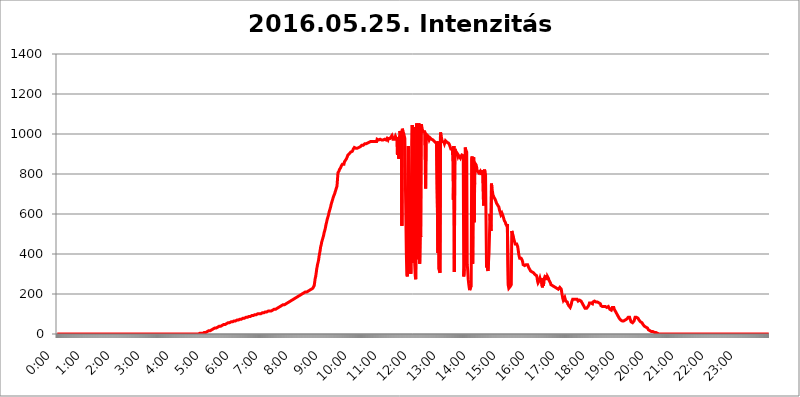
| Category | 2016.05.25. Intenzitás [W/m^2] |
|---|---|
| 0.0 | 0 |
| 0.0006944444444444445 | 0 |
| 0.001388888888888889 | 0 |
| 0.0020833333333333333 | 0 |
| 0.002777777777777778 | 0 |
| 0.003472222222222222 | 0 |
| 0.004166666666666667 | 0 |
| 0.004861111111111111 | 0 |
| 0.005555555555555556 | 0 |
| 0.0062499999999999995 | 0 |
| 0.006944444444444444 | 0 |
| 0.007638888888888889 | 0 |
| 0.008333333333333333 | 0 |
| 0.009027777777777779 | 0 |
| 0.009722222222222222 | 0 |
| 0.010416666666666666 | 0 |
| 0.011111111111111112 | 0 |
| 0.011805555555555555 | 0 |
| 0.012499999999999999 | 0 |
| 0.013194444444444444 | 0 |
| 0.013888888888888888 | 0 |
| 0.014583333333333332 | 0 |
| 0.015277777777777777 | 0 |
| 0.015972222222222224 | 0 |
| 0.016666666666666666 | 0 |
| 0.017361111111111112 | 0 |
| 0.018055555555555557 | 0 |
| 0.01875 | 0 |
| 0.019444444444444445 | 0 |
| 0.02013888888888889 | 0 |
| 0.020833333333333332 | 0 |
| 0.02152777777777778 | 0 |
| 0.022222222222222223 | 0 |
| 0.02291666666666667 | 0 |
| 0.02361111111111111 | 0 |
| 0.024305555555555556 | 0 |
| 0.024999999999999998 | 0 |
| 0.025694444444444447 | 0 |
| 0.02638888888888889 | 0 |
| 0.027083333333333334 | 0 |
| 0.027777777777777776 | 0 |
| 0.02847222222222222 | 0 |
| 0.029166666666666664 | 0 |
| 0.029861111111111113 | 0 |
| 0.030555555555555555 | 0 |
| 0.03125 | 0 |
| 0.03194444444444445 | 0 |
| 0.03263888888888889 | 0 |
| 0.03333333333333333 | 0 |
| 0.034027777777777775 | 0 |
| 0.034722222222222224 | 0 |
| 0.035416666666666666 | 0 |
| 0.036111111111111115 | 0 |
| 0.03680555555555556 | 0 |
| 0.0375 | 0 |
| 0.03819444444444444 | 0 |
| 0.03888888888888889 | 0 |
| 0.03958333333333333 | 0 |
| 0.04027777777777778 | 0 |
| 0.04097222222222222 | 0 |
| 0.041666666666666664 | 0 |
| 0.042361111111111106 | 0 |
| 0.04305555555555556 | 0 |
| 0.043750000000000004 | 0 |
| 0.044444444444444446 | 0 |
| 0.04513888888888889 | 0 |
| 0.04583333333333334 | 0 |
| 0.04652777777777778 | 0 |
| 0.04722222222222222 | 0 |
| 0.04791666666666666 | 0 |
| 0.04861111111111111 | 0 |
| 0.049305555555555554 | 0 |
| 0.049999999999999996 | 0 |
| 0.05069444444444445 | 0 |
| 0.051388888888888894 | 0 |
| 0.052083333333333336 | 0 |
| 0.05277777777777778 | 0 |
| 0.05347222222222222 | 0 |
| 0.05416666666666667 | 0 |
| 0.05486111111111111 | 0 |
| 0.05555555555555555 | 0 |
| 0.05625 | 0 |
| 0.05694444444444444 | 0 |
| 0.057638888888888885 | 0 |
| 0.05833333333333333 | 0 |
| 0.05902777777777778 | 0 |
| 0.059722222222222225 | 0 |
| 0.06041666666666667 | 0 |
| 0.061111111111111116 | 0 |
| 0.06180555555555556 | 0 |
| 0.0625 | 0 |
| 0.06319444444444444 | 0 |
| 0.06388888888888888 | 0 |
| 0.06458333333333334 | 0 |
| 0.06527777777777778 | 0 |
| 0.06597222222222222 | 0 |
| 0.06666666666666667 | 0 |
| 0.06736111111111111 | 0 |
| 0.06805555555555555 | 0 |
| 0.06874999999999999 | 0 |
| 0.06944444444444443 | 0 |
| 0.07013888888888889 | 0 |
| 0.07083333333333333 | 0 |
| 0.07152777777777779 | 0 |
| 0.07222222222222223 | 0 |
| 0.07291666666666667 | 0 |
| 0.07361111111111111 | 0 |
| 0.07430555555555556 | 0 |
| 0.075 | 0 |
| 0.07569444444444444 | 0 |
| 0.0763888888888889 | 0 |
| 0.07708333333333334 | 0 |
| 0.07777777777777778 | 0 |
| 0.07847222222222222 | 0 |
| 0.07916666666666666 | 0 |
| 0.0798611111111111 | 0 |
| 0.08055555555555556 | 0 |
| 0.08125 | 0 |
| 0.08194444444444444 | 0 |
| 0.08263888888888889 | 0 |
| 0.08333333333333333 | 0 |
| 0.08402777777777777 | 0 |
| 0.08472222222222221 | 0 |
| 0.08541666666666665 | 0 |
| 0.08611111111111112 | 0 |
| 0.08680555555555557 | 0 |
| 0.08750000000000001 | 0 |
| 0.08819444444444445 | 0 |
| 0.08888888888888889 | 0 |
| 0.08958333333333333 | 0 |
| 0.09027777777777778 | 0 |
| 0.09097222222222222 | 0 |
| 0.09166666666666667 | 0 |
| 0.09236111111111112 | 0 |
| 0.09305555555555556 | 0 |
| 0.09375 | 0 |
| 0.09444444444444444 | 0 |
| 0.09513888888888888 | 0 |
| 0.09583333333333333 | 0 |
| 0.09652777777777777 | 0 |
| 0.09722222222222222 | 0 |
| 0.09791666666666667 | 0 |
| 0.09861111111111111 | 0 |
| 0.09930555555555555 | 0 |
| 0.09999999999999999 | 0 |
| 0.10069444444444443 | 0 |
| 0.1013888888888889 | 0 |
| 0.10208333333333335 | 0 |
| 0.10277777777777779 | 0 |
| 0.10347222222222223 | 0 |
| 0.10416666666666667 | 0 |
| 0.10486111111111111 | 0 |
| 0.10555555555555556 | 0 |
| 0.10625 | 0 |
| 0.10694444444444444 | 0 |
| 0.1076388888888889 | 0 |
| 0.10833333333333334 | 0 |
| 0.10902777777777778 | 0 |
| 0.10972222222222222 | 0 |
| 0.1111111111111111 | 0 |
| 0.11180555555555556 | 0 |
| 0.11180555555555556 | 0 |
| 0.1125 | 0 |
| 0.11319444444444444 | 0 |
| 0.11388888888888889 | 0 |
| 0.11458333333333333 | 0 |
| 0.11527777777777777 | 0 |
| 0.11597222222222221 | 0 |
| 0.11666666666666665 | 0 |
| 0.1173611111111111 | 0 |
| 0.11805555555555557 | 0 |
| 0.11944444444444445 | 0 |
| 0.12013888888888889 | 0 |
| 0.12083333333333333 | 0 |
| 0.12152777777777778 | 0 |
| 0.12222222222222223 | 0 |
| 0.12291666666666667 | 0 |
| 0.12291666666666667 | 0 |
| 0.12361111111111112 | 0 |
| 0.12430555555555556 | 0 |
| 0.125 | 0 |
| 0.12569444444444444 | 0 |
| 0.12638888888888888 | 0 |
| 0.12708333333333333 | 0 |
| 0.16875 | 0 |
| 0.12847222222222224 | 0 |
| 0.12916666666666668 | 0 |
| 0.12986111111111112 | 0 |
| 0.13055555555555556 | 0 |
| 0.13125 | 0 |
| 0.13194444444444445 | 0 |
| 0.1326388888888889 | 0 |
| 0.13333333333333333 | 0 |
| 0.13402777777777777 | 0 |
| 0.13402777777777777 | 0 |
| 0.13472222222222222 | 0 |
| 0.13541666666666666 | 0 |
| 0.1361111111111111 | 0 |
| 0.13749999999999998 | 0 |
| 0.13819444444444443 | 0 |
| 0.1388888888888889 | 0 |
| 0.13958333333333334 | 0 |
| 0.14027777777777778 | 0 |
| 0.14097222222222222 | 0 |
| 0.14166666666666666 | 0 |
| 0.1423611111111111 | 0 |
| 0.14305555555555557 | 0 |
| 0.14375000000000002 | 0 |
| 0.14444444444444446 | 0 |
| 0.1451388888888889 | 0 |
| 0.1451388888888889 | 0 |
| 0.14652777777777778 | 0 |
| 0.14722222222222223 | 0 |
| 0.14791666666666667 | 0 |
| 0.1486111111111111 | 0 |
| 0.14930555555555555 | 0 |
| 0.15 | 0 |
| 0.15069444444444444 | 0 |
| 0.15138888888888888 | 0 |
| 0.15208333333333332 | 0 |
| 0.15277777777777776 | 0 |
| 0.15347222222222223 | 0 |
| 0.15416666666666667 | 0 |
| 0.15486111111111112 | 0 |
| 0.15555555555555556 | 0 |
| 0.15625 | 0 |
| 0.15694444444444444 | 0 |
| 0.15763888888888888 | 0 |
| 0.15833333333333333 | 0 |
| 0.15902777777777777 | 0 |
| 0.15972222222222224 | 0 |
| 0.16041666666666668 | 0 |
| 0.16111111111111112 | 0 |
| 0.16180555555555556 | 0 |
| 0.1625 | 0 |
| 0.16319444444444445 | 0 |
| 0.1638888888888889 | 0 |
| 0.16458333333333333 | 0 |
| 0.16527777777777777 | 0 |
| 0.16597222222222222 | 0 |
| 0.16666666666666666 | 0 |
| 0.1673611111111111 | 0 |
| 0.16805555555555554 | 0 |
| 0.16874999999999998 | 0 |
| 0.16944444444444443 | 0 |
| 0.17013888888888887 | 0 |
| 0.1708333333333333 | 0 |
| 0.17152777777777775 | 0 |
| 0.17222222222222225 | 0 |
| 0.1729166666666667 | 0 |
| 0.17361111111111113 | 0 |
| 0.17430555555555557 | 0 |
| 0.17500000000000002 | 0 |
| 0.17569444444444446 | 0 |
| 0.1763888888888889 | 0 |
| 0.17708333333333334 | 0 |
| 0.17777777777777778 | 0 |
| 0.17847222222222223 | 0 |
| 0.17916666666666667 | 0 |
| 0.1798611111111111 | 0 |
| 0.18055555555555555 | 0 |
| 0.18125 | 0 |
| 0.18194444444444444 | 0 |
| 0.1826388888888889 | 0 |
| 0.18333333333333335 | 0 |
| 0.1840277777777778 | 0 |
| 0.18472222222222223 | 0 |
| 0.18541666666666667 | 0 |
| 0.18611111111111112 | 0 |
| 0.18680555555555556 | 0 |
| 0.1875 | 0 |
| 0.18819444444444444 | 0 |
| 0.18888888888888888 | 0 |
| 0.18958333333333333 | 0 |
| 0.19027777777777777 | 0 |
| 0.1909722222222222 | 0 |
| 0.19166666666666665 | 0 |
| 0.19236111111111112 | 0 |
| 0.19305555555555554 | 0 |
| 0.19375 | 0 |
| 0.19444444444444445 | 0 |
| 0.1951388888888889 | 0 |
| 0.19583333333333333 | 0 |
| 0.19652777777777777 | 0 |
| 0.19722222222222222 | 0 |
| 0.19791666666666666 | 0 |
| 0.1986111111111111 | 0 |
| 0.19930555555555554 | 3.525 |
| 0.19999999999999998 | 3.525 |
| 0.20069444444444443 | 3.525 |
| 0.20138888888888887 | 3.525 |
| 0.2020833333333333 | 3.525 |
| 0.2027777777777778 | 3.525 |
| 0.2034722222222222 | 3.525 |
| 0.2041666666666667 | 3.525 |
| 0.20486111111111113 | 7.887 |
| 0.20555555555555557 | 7.887 |
| 0.20625000000000002 | 7.887 |
| 0.20694444444444446 | 7.887 |
| 0.2076388888888889 | 7.887 |
| 0.20833333333333334 | 7.887 |
| 0.20902777777777778 | 12.257 |
| 0.20972222222222223 | 12.257 |
| 0.21041666666666667 | 12.257 |
| 0.2111111111111111 | 12.257 |
| 0.21180555555555555 | 12.257 |
| 0.2125 | 16.636 |
| 0.21319444444444444 | 16.636 |
| 0.2138888888888889 | 16.636 |
| 0.21458333333333335 | 16.636 |
| 0.2152777777777778 | 21.024 |
| 0.21597222222222223 | 21.024 |
| 0.21666666666666667 | 21.024 |
| 0.21736111111111112 | 21.024 |
| 0.21805555555555556 | 21.024 |
| 0.21875 | 25.419 |
| 0.21944444444444444 | 25.419 |
| 0.22013888888888888 | 25.419 |
| 0.22083333333333333 | 29.823 |
| 0.22152777777777777 | 29.823 |
| 0.2222222222222222 | 29.823 |
| 0.22291666666666665 | 29.823 |
| 0.2236111111111111 | 34.234 |
| 0.22430555555555556 | 34.234 |
| 0.225 | 34.234 |
| 0.22569444444444445 | 34.234 |
| 0.2263888888888889 | 38.653 |
| 0.22708333333333333 | 38.653 |
| 0.22777777777777777 | 38.653 |
| 0.22847222222222222 | 38.653 |
| 0.22916666666666666 | 38.653 |
| 0.2298611111111111 | 38.653 |
| 0.23055555555555554 | 43.079 |
| 0.23124999999999998 | 43.079 |
| 0.23194444444444443 | 43.079 |
| 0.23263888888888887 | 47.511 |
| 0.2333333333333333 | 47.511 |
| 0.2340277777777778 | 47.511 |
| 0.2347222222222222 | 47.511 |
| 0.2354166666666667 | 47.511 |
| 0.23611111111111113 | 51.951 |
| 0.23680555555555557 | 51.951 |
| 0.23750000000000002 | 51.951 |
| 0.23819444444444446 | 51.951 |
| 0.2388888888888889 | 56.398 |
| 0.23958333333333334 | 56.398 |
| 0.24027777777777778 | 56.398 |
| 0.24097222222222223 | 56.398 |
| 0.24166666666666667 | 56.398 |
| 0.2423611111111111 | 56.398 |
| 0.24305555555555555 | 56.398 |
| 0.24375 | 60.85 |
| 0.24444444444444446 | 60.85 |
| 0.24513888888888888 | 60.85 |
| 0.24583333333333335 | 60.85 |
| 0.2465277777777778 | 65.31 |
| 0.24722222222222223 | 65.31 |
| 0.24791666666666667 | 65.31 |
| 0.24861111111111112 | 65.31 |
| 0.24930555555555556 | 65.31 |
| 0.25 | 65.31 |
| 0.25069444444444444 | 65.31 |
| 0.2513888888888889 | 69.775 |
| 0.2520833333333333 | 69.775 |
| 0.25277777777777777 | 69.775 |
| 0.2534722222222222 | 69.775 |
| 0.25416666666666665 | 69.775 |
| 0.2548611111111111 | 69.775 |
| 0.2555555555555556 | 74.246 |
| 0.25625000000000003 | 74.246 |
| 0.2569444444444445 | 74.246 |
| 0.2576388888888889 | 74.246 |
| 0.25833333333333336 | 74.246 |
| 0.2590277777777778 | 78.722 |
| 0.25972222222222224 | 74.246 |
| 0.2604166666666667 | 78.722 |
| 0.2611111111111111 | 78.722 |
| 0.26180555555555557 | 78.722 |
| 0.2625 | 78.722 |
| 0.26319444444444445 | 83.205 |
| 0.2638888888888889 | 83.205 |
| 0.26458333333333334 | 83.205 |
| 0.2652777777777778 | 83.205 |
| 0.2659722222222222 | 83.205 |
| 0.26666666666666666 | 83.205 |
| 0.2673611111111111 | 83.205 |
| 0.26805555555555555 | 83.205 |
| 0.26875 | 87.692 |
| 0.26944444444444443 | 87.692 |
| 0.2701388888888889 | 87.692 |
| 0.2708333333333333 | 87.692 |
| 0.27152777777777776 | 87.692 |
| 0.2722222222222222 | 87.692 |
| 0.27291666666666664 | 92.184 |
| 0.2736111111111111 | 92.184 |
| 0.2743055555555555 | 92.184 |
| 0.27499999999999997 | 92.184 |
| 0.27569444444444446 | 92.184 |
| 0.27638888888888885 | 92.184 |
| 0.27708333333333335 | 96.682 |
| 0.2777777777777778 | 96.682 |
| 0.27847222222222223 | 96.682 |
| 0.2791666666666667 | 96.682 |
| 0.2798611111111111 | 96.682 |
| 0.28055555555555556 | 96.682 |
| 0.28125 | 101.184 |
| 0.28194444444444444 | 101.184 |
| 0.2826388888888889 | 101.184 |
| 0.2833333333333333 | 101.184 |
| 0.28402777777777777 | 101.184 |
| 0.2847222222222222 | 101.184 |
| 0.28541666666666665 | 101.184 |
| 0.28611111111111115 | 101.184 |
| 0.28680555555555554 | 101.184 |
| 0.28750000000000003 | 105.69 |
| 0.2881944444444445 | 105.69 |
| 0.2888888888888889 | 105.69 |
| 0.28958333333333336 | 105.69 |
| 0.2902777777777778 | 110.201 |
| 0.29097222222222224 | 110.201 |
| 0.2916666666666667 | 110.201 |
| 0.2923611111111111 | 110.201 |
| 0.29305555555555557 | 110.201 |
| 0.29375 | 110.201 |
| 0.29444444444444445 | 110.201 |
| 0.2951388888888889 | 110.201 |
| 0.29583333333333334 | 114.716 |
| 0.2965277777777778 | 114.716 |
| 0.2972222222222222 | 114.716 |
| 0.29791666666666666 | 114.716 |
| 0.2986111111111111 | 114.716 |
| 0.29930555555555555 | 114.716 |
| 0.3 | 114.716 |
| 0.30069444444444443 | 119.235 |
| 0.3013888888888889 | 119.235 |
| 0.3020833333333333 | 119.235 |
| 0.30277777777777776 | 119.235 |
| 0.3034722222222222 | 119.235 |
| 0.30416666666666664 | 123.758 |
| 0.3048611111111111 | 123.758 |
| 0.3055555555555555 | 123.758 |
| 0.30624999999999997 | 123.758 |
| 0.3069444444444444 | 123.758 |
| 0.3076388888888889 | 128.284 |
| 0.30833333333333335 | 128.284 |
| 0.3090277777777778 | 128.284 |
| 0.30972222222222223 | 132.814 |
| 0.3104166666666667 | 132.814 |
| 0.3111111111111111 | 137.347 |
| 0.31180555555555556 | 137.347 |
| 0.3125 | 137.347 |
| 0.31319444444444444 | 137.347 |
| 0.3138888888888889 | 141.884 |
| 0.3145833333333333 | 141.884 |
| 0.31527777777777777 | 141.884 |
| 0.3159722222222222 | 141.884 |
| 0.31666666666666665 | 146.423 |
| 0.31736111111111115 | 146.423 |
| 0.31805555555555554 | 146.423 |
| 0.31875000000000003 | 146.423 |
| 0.3194444444444445 | 150.964 |
| 0.3201388888888889 | 150.964 |
| 0.32083333333333336 | 150.964 |
| 0.3215277777777778 | 155.509 |
| 0.32222222222222224 | 155.509 |
| 0.3229166666666667 | 155.509 |
| 0.3236111111111111 | 155.509 |
| 0.32430555555555557 | 155.509 |
| 0.325 | 160.056 |
| 0.32569444444444445 | 160.056 |
| 0.3263888888888889 | 164.605 |
| 0.32708333333333334 | 164.605 |
| 0.3277777777777778 | 164.605 |
| 0.3284722222222222 | 169.156 |
| 0.32916666666666666 | 169.156 |
| 0.3298611111111111 | 169.156 |
| 0.33055555555555555 | 173.709 |
| 0.33125 | 173.709 |
| 0.33194444444444443 | 173.709 |
| 0.3326388888888889 | 173.709 |
| 0.3333333333333333 | 178.264 |
| 0.3340277777777778 | 178.264 |
| 0.3347222222222222 | 182.82 |
| 0.3354166666666667 | 182.82 |
| 0.3361111111111111 | 182.82 |
| 0.3368055555555556 | 182.82 |
| 0.33749999999999997 | 187.378 |
| 0.33819444444444446 | 187.378 |
| 0.33888888888888885 | 187.378 |
| 0.33958333333333335 | 191.937 |
| 0.34027777777777773 | 191.937 |
| 0.34097222222222223 | 191.937 |
| 0.3416666666666666 | 196.497 |
| 0.3423611111111111 | 196.497 |
| 0.3430555555555555 | 201.058 |
| 0.34375 | 201.058 |
| 0.3444444444444445 | 201.058 |
| 0.3451388888888889 | 201.058 |
| 0.3458333333333334 | 205.62 |
| 0.34652777777777777 | 205.62 |
| 0.34722222222222227 | 205.62 |
| 0.34791666666666665 | 210.182 |
| 0.34861111111111115 | 210.182 |
| 0.34930555555555554 | 210.182 |
| 0.35000000000000003 | 210.182 |
| 0.3506944444444444 | 214.746 |
| 0.3513888888888889 | 214.746 |
| 0.3520833333333333 | 214.746 |
| 0.3527777777777778 | 219.309 |
| 0.3534722222222222 | 219.309 |
| 0.3541666666666667 | 219.309 |
| 0.3548611111111111 | 219.309 |
| 0.35555555555555557 | 219.309 |
| 0.35625 | 223.873 |
| 0.35694444444444445 | 223.873 |
| 0.3576388888888889 | 223.873 |
| 0.35833333333333334 | 228.436 |
| 0.3590277777777778 | 228.436 |
| 0.3597222222222222 | 233 |
| 0.36041666666666666 | 242.127 |
| 0.3611111111111111 | 260.373 |
| 0.36180555555555555 | 278.603 |
| 0.3625 | 287.709 |
| 0.36319444444444443 | 305.898 |
| 0.3638888888888889 | 324.052 |
| 0.3645833333333333 | 337.639 |
| 0.3652777777777778 | 351.198 |
| 0.3659722222222222 | 360.221 |
| 0.3666666666666667 | 373.729 |
| 0.3673611111111111 | 391.685 |
| 0.3680555555555556 | 405.108 |
| 0.36874999999999997 | 418.492 |
| 0.36944444444444446 | 436.27 |
| 0.37013888888888885 | 445.129 |
| 0.37083333333333335 | 458.38 |
| 0.37152777777777773 | 467.187 |
| 0.37222222222222223 | 475.972 |
| 0.3729166666666666 | 484.735 |
| 0.3736111111111111 | 493.475 |
| 0.3743055555555555 | 506.542 |
| 0.375 | 515.223 |
| 0.3756944444444445 | 523.88 |
| 0.3763888888888889 | 536.82 |
| 0.3770833333333334 | 549.704 |
| 0.37777777777777777 | 558.261 |
| 0.37847222222222227 | 571.049 |
| 0.37916666666666665 | 579.542 |
| 0.37986111111111115 | 588.009 |
| 0.38055555555555554 | 596.45 |
| 0.38125000000000003 | 609.062 |
| 0.3819444444444444 | 617.436 |
| 0.3826388888888889 | 625.784 |
| 0.3833333333333333 | 634.105 |
| 0.3840277777777778 | 646.537 |
| 0.3847222222222222 | 654.791 |
| 0.3854166666666667 | 663.019 |
| 0.3861111111111111 | 671.22 |
| 0.38680555555555557 | 679.395 |
| 0.3875 | 687.544 |
| 0.38819444444444445 | 691.608 |
| 0.3888888888888889 | 699.717 |
| 0.38958333333333334 | 707.8 |
| 0.3902777777777778 | 715.858 |
| 0.3909722222222222 | 723.889 |
| 0.39166666666666666 | 731.896 |
| 0.3923611111111111 | 739.877 |
| 0.39305555555555555 | 743.859 |
| 0.39375 | 806.757 |
| 0.39444444444444443 | 806.757 |
| 0.3951388888888889 | 814.519 |
| 0.3958333333333333 | 822.26 |
| 0.3965277777777778 | 826.123 |
| 0.3972222222222222 | 829.981 |
| 0.3979166666666667 | 833.834 |
| 0.3986111111111111 | 841.526 |
| 0.3993055555555556 | 845.365 |
| 0.39999999999999997 | 849.199 |
| 0.40069444444444446 | 849.199 |
| 0.40138888888888885 | 853.029 |
| 0.40208333333333335 | 849.199 |
| 0.40277777777777773 | 860.676 |
| 0.40347222222222223 | 864.493 |
| 0.4041666666666666 | 868.305 |
| 0.4048611111111111 | 872.114 |
| 0.4055555555555555 | 875.918 |
| 0.40625 | 879.719 |
| 0.4069444444444445 | 887.309 |
| 0.4076388888888889 | 894.885 |
| 0.4083333333333334 | 894.885 |
| 0.40902777777777777 | 894.885 |
| 0.40972222222222227 | 902.447 |
| 0.41041666666666665 | 902.447 |
| 0.41111111111111115 | 906.223 |
| 0.41180555555555554 | 909.996 |
| 0.41250000000000003 | 909.996 |
| 0.4131944444444444 | 909.996 |
| 0.4138888888888889 | 913.766 |
| 0.4145833333333333 | 917.534 |
| 0.4152777777777778 | 925.06 |
| 0.4159722222222222 | 925.06 |
| 0.4166666666666667 | 932.576 |
| 0.4173611111111111 | 928.819 |
| 0.41805555555555557 | 928.819 |
| 0.41875 | 928.819 |
| 0.41944444444444445 | 928.819 |
| 0.4201388888888889 | 928.819 |
| 0.42083333333333334 | 928.819 |
| 0.4215277777777778 | 928.819 |
| 0.4222222222222222 | 932.576 |
| 0.42291666666666666 | 932.576 |
| 0.4236111111111111 | 932.576 |
| 0.42430555555555555 | 936.33 |
| 0.425 | 936.33 |
| 0.42569444444444443 | 940.082 |
| 0.4263888888888889 | 940.082 |
| 0.4270833333333333 | 943.832 |
| 0.4277777777777778 | 947.58 |
| 0.4284722222222222 | 947.58 |
| 0.4291666666666667 | 943.832 |
| 0.4298611111111111 | 947.58 |
| 0.4305555555555556 | 947.58 |
| 0.43124999999999997 | 951.327 |
| 0.43194444444444446 | 947.58 |
| 0.43263888888888885 | 951.327 |
| 0.43333333333333335 | 951.327 |
| 0.43402777777777773 | 955.071 |
| 0.43472222222222223 | 955.071 |
| 0.4354166666666666 | 955.071 |
| 0.4361111111111111 | 955.071 |
| 0.4368055555555555 | 955.071 |
| 0.4375 | 958.814 |
| 0.4381944444444445 | 962.555 |
| 0.4388888888888889 | 962.555 |
| 0.4395833333333334 | 962.555 |
| 0.44027777777777777 | 962.555 |
| 0.44097222222222227 | 962.555 |
| 0.44166666666666665 | 962.555 |
| 0.44236111111111115 | 966.295 |
| 0.44305555555555554 | 962.555 |
| 0.44375000000000003 | 962.555 |
| 0.4444444444444444 | 966.295 |
| 0.4451388888888889 | 966.295 |
| 0.4458333333333333 | 962.555 |
| 0.4465277777777778 | 966.295 |
| 0.4472222222222222 | 966.295 |
| 0.4479166666666667 | 962.555 |
| 0.4486111111111111 | 973.772 |
| 0.44930555555555557 | 973.772 |
| 0.45 | 973.772 |
| 0.45069444444444445 | 970.034 |
| 0.4513888888888889 | 973.772 |
| 0.45208333333333334 | 973.772 |
| 0.4527777777777778 | 973.772 |
| 0.4534722222222222 | 973.772 |
| 0.45416666666666666 | 970.034 |
| 0.4548611111111111 | 970.034 |
| 0.45555555555555555 | 966.295 |
| 0.45625 | 970.034 |
| 0.45694444444444443 | 970.034 |
| 0.4576388888888889 | 970.034 |
| 0.4583333333333333 | 970.034 |
| 0.4590277777777778 | 973.772 |
| 0.4597222222222222 | 973.772 |
| 0.4604166666666667 | 970.034 |
| 0.4611111111111111 | 970.034 |
| 0.4618055555555556 | 970.034 |
| 0.46249999999999997 | 977.508 |
| 0.46319444444444446 | 973.772 |
| 0.46388888888888885 | 970.034 |
| 0.46458333333333335 | 977.508 |
| 0.46527777777777773 | 977.508 |
| 0.46597222222222223 | 981.244 |
| 0.4666666666666666 | 977.508 |
| 0.4673611111111111 | 977.508 |
| 0.4680555555555555 | 984.98 |
| 0.46875 | 981.244 |
| 0.4694444444444445 | 992.448 |
| 0.4701388888888889 | 984.98 |
| 0.4708333333333334 | 973.772 |
| 0.47152777777777777 | 977.508 |
| 0.47222222222222227 | 970.034 |
| 0.47291666666666665 | 973.772 |
| 0.47361111111111115 | 977.508 |
| 0.47430555555555554 | 988.714 |
| 0.47500000000000003 | 984.98 |
| 0.4756944444444444 | 977.508 |
| 0.4763888888888889 | 970.034 |
| 0.4770833333333333 | 894.885 |
| 0.4777777777777778 | 984.98 |
| 0.4784722222222222 | 984.98 |
| 0.4791666666666667 | 875.918 |
| 0.4798611111111111 | 970.034 |
| 0.48055555555555557 | 1014.852 |
| 0.48125 | 1007.383 |
| 0.48194444444444445 | 996.182 |
| 0.4826388888888889 | 1014.852 |
| 0.48333333333333334 | 541.121 |
| 0.4840277777777778 | 1026.06 |
| 0.4847222222222222 | 1014.852 |
| 0.48541666666666666 | 1011.118 |
| 0.4861111111111111 | 999.916 |
| 0.48680555555555555 | 988.714 |
| 0.4875 | 977.508 |
| 0.48819444444444443 | 973.772 |
| 0.4888888888888889 | 977.508 |
| 0.4895833333333333 | 409.574 |
| 0.4902777777777778 | 296.808 |
| 0.4909722222222222 | 287.709 |
| 0.4916666666666667 | 319.517 |
| 0.4923611111111111 | 940.082 |
| 0.4930555555555556 | 360.221 |
| 0.49374999999999997 | 337.639 |
| 0.49444444444444446 | 414.035 |
| 0.49513888888888885 | 625.784 |
| 0.49583333333333335 | 301.354 |
| 0.49652777777777773 | 629.948 |
| 0.49722222222222223 | 962.555 |
| 0.4979166666666666 | 1044.762 |
| 0.4986111111111111 | 1041.019 |
| 0.4993055555555555 | 355.712 |
| 0.5 | 1033.537 |
| 0.5006944444444444 | 1026.06 |
| 0.5013888888888889 | 346.682 |
| 0.5020833333333333 | 292.259 |
| 0.5027777777777778 | 274.047 |
| 0.5034722222222222 | 278.603 |
| 0.5041666666666667 | 1052.255 |
| 0.5048611111111111 | 928.819 |
| 0.5055555555555555 | 860.676 |
| 0.50625 | 373.729 |
| 0.5069444444444444 | 1052.255 |
| 0.5076388888888889 | 1044.762 |
| 0.5083333333333333 | 351.198 |
| 0.5090277777777777 | 519.555 |
| 0.5097222222222222 | 484.735 |
| 0.5104166666666666 | 1048.508 |
| 0.5111111111111112 | 1041.019 |
| 0.5118055555555555 | 1026.06 |
| 0.5125000000000001 | 1018.587 |
| 0.5131944444444444 | 1011.118 |
| 0.513888888888889 | 1011.118 |
| 0.5145833333333333 | 1014.852 |
| 0.5152777777777778 | 1011.118 |
| 0.5159722222222222 | 1011.118 |
| 0.5166666666666667 | 727.896 |
| 0.517361111111111 | 999.916 |
| 0.5180555555555556 | 1003.65 |
| 0.5187499999999999 | 999.916 |
| 0.5194444444444445 | 992.448 |
| 0.5201388888888888 | 984.98 |
| 0.5208333333333334 | 977.508 |
| 0.5215277777777778 | 970.034 |
| 0.5222222222222223 | 970.034 |
| 0.5229166666666667 | 981.244 |
| 0.5236111111111111 | 977.508 |
| 0.5243055555555556 | 977.508 |
| 0.525 | 973.772 |
| 0.5256944444444445 | 973.772 |
| 0.5263888888888889 | 970.034 |
| 0.5270833333333333 | 970.034 |
| 0.5277777777777778 | 970.034 |
| 0.5284722222222222 | 966.295 |
| 0.5291666666666667 | 962.555 |
| 0.5298611111111111 | 962.555 |
| 0.5305555555555556 | 962.555 |
| 0.53125 | 955.071 |
| 0.5319444444444444 | 962.555 |
| 0.5326388888888889 | 958.814 |
| 0.5333333333333333 | 962.555 |
| 0.5340277777777778 | 405.108 |
| 0.5347222222222222 | 962.555 |
| 0.5354166666666667 | 324.052 |
| 0.5361111111111111 | 319.517 |
| 0.5368055555555555 | 305.898 |
| 0.5375 | 1007.383 |
| 0.5381944444444444 | 999.916 |
| 0.5388888888888889 | 981.244 |
| 0.5395833333333333 | 970.034 |
| 0.5402777777777777 | 962.555 |
| 0.5409722222222222 | 966.295 |
| 0.5416666666666666 | 962.555 |
| 0.5423611111111112 | 958.814 |
| 0.5430555555555555 | 951.327 |
| 0.5437500000000001 | 955.071 |
| 0.5444444444444444 | 966.295 |
| 0.545138888888889 | 970.034 |
| 0.5458333333333333 | 966.295 |
| 0.5465277777777778 | 958.814 |
| 0.5472222222222222 | 958.814 |
| 0.5479166666666667 | 958.814 |
| 0.548611111111111 | 955.071 |
| 0.5493055555555556 | 951.327 |
| 0.5499999999999999 | 947.58 |
| 0.5506944444444445 | 940.082 |
| 0.5513888888888888 | 932.576 |
| 0.5520833333333334 | 925.06 |
| 0.5527777777777778 | 925.06 |
| 0.5534722222222223 | 921.298 |
| 0.5541666666666667 | 925.06 |
| 0.5548611111111111 | 868.305 |
| 0.5555555555555556 | 671.22 |
| 0.55625 | 940.082 |
| 0.5569444444444445 | 310.44 |
| 0.5576388888888889 | 925.06 |
| 0.5583333333333333 | 917.534 |
| 0.5590277777777778 | 913.766 |
| 0.5597222222222222 | 909.996 |
| 0.5604166666666667 | 902.447 |
| 0.5611111111111111 | 894.885 |
| 0.5618055555555556 | 887.309 |
| 0.5625 | 894.885 |
| 0.5631944444444444 | 894.885 |
| 0.5638888888888889 | 887.309 |
| 0.5645833333333333 | 883.516 |
| 0.5652777777777778 | 879.719 |
| 0.5659722222222222 | 887.309 |
| 0.5666666666666667 | 883.516 |
| 0.5673611111111111 | 894.885 |
| 0.5680555555555555 | 891.099 |
| 0.56875 | 898.668 |
| 0.5694444444444444 | 891.099 |
| 0.5701388888888889 | 287.709 |
| 0.5708333333333333 | 324.052 |
| 0.5715277777777777 | 369.23 |
| 0.5722222222222222 | 932.576 |
| 0.5729166666666666 | 921.298 |
| 0.5736111111111112 | 917.534 |
| 0.5743055555555555 | 909.996 |
| 0.5750000000000001 | 346.682 |
| 0.5756944444444444 | 319.517 |
| 0.576388888888889 | 274.047 |
| 0.5770833333333333 | 251.251 |
| 0.5777777777777778 | 233 |
| 0.5784722222222222 | 219.309 |
| 0.5791666666666667 | 219.309 |
| 0.579861111111111 | 219.309 |
| 0.5805555555555556 | 242.127 |
| 0.5812499999999999 | 875.918 |
| 0.5819444444444445 | 887.309 |
| 0.5826388888888888 | 351.198 |
| 0.5833333333333334 | 699.717 |
| 0.5840277777777778 | 883.516 |
| 0.5847222222222223 | 558.261 |
| 0.5854166666666667 | 755.766 |
| 0.5861111111111111 | 853.029 |
| 0.5868055555555556 | 853.029 |
| 0.5875 | 845.365 |
| 0.5881944444444445 | 833.834 |
| 0.5888888888888889 | 818.392 |
| 0.5895833333333333 | 814.519 |
| 0.5902777777777778 | 814.519 |
| 0.5909722222222222 | 806.757 |
| 0.5916666666666667 | 806.757 |
| 0.5923611111111111 | 810.641 |
| 0.5930555555555556 | 814.519 |
| 0.59375 | 810.641 |
| 0.5944444444444444 | 795.074 |
| 0.5951388888888889 | 818.392 |
| 0.5958333333333333 | 810.641 |
| 0.5965277777777778 | 802.868 |
| 0.5972222222222222 | 802.868 |
| 0.5979166666666667 | 642.4 |
| 0.5986111111111111 | 814.519 |
| 0.5993055555555555 | 822.26 |
| 0.6 | 806.757 |
| 0.6006944444444444 | 798.974 |
| 0.6013888888888889 | 795.074 |
| 0.6020833333333333 | 333.113 |
| 0.6027777777777777 | 355.712 |
| 0.6034722222222222 | 324.052 |
| 0.6041666666666666 | 314.98 |
| 0.6048611111111112 | 360.221 |
| 0.6055555555555555 | 405.108 |
| 0.6062500000000001 | 497.836 |
| 0.6069444444444444 | 600.661 |
| 0.607638888888889 | 558.261 |
| 0.6083333333333333 | 515.223 |
| 0.6090277777777778 | 751.803 |
| 0.6097222222222222 | 727.896 |
| 0.6104166666666667 | 711.832 |
| 0.611111111111111 | 695.666 |
| 0.6118055555555556 | 691.608 |
| 0.6124999999999999 | 683.473 |
| 0.6131944444444445 | 679.395 |
| 0.6138888888888888 | 675.311 |
| 0.6145833333333334 | 671.22 |
| 0.6152777777777778 | 663.019 |
| 0.6159722222222223 | 654.791 |
| 0.6166666666666667 | 650.667 |
| 0.6173611111111111 | 654.791 |
| 0.6180555555555556 | 642.4 |
| 0.61875 | 638.256 |
| 0.6194444444444445 | 634.105 |
| 0.6201388888888889 | 621.613 |
| 0.6208333333333333 | 613.252 |
| 0.6215277777777778 | 604.864 |
| 0.6222222222222222 | 596.45 |
| 0.6229166666666667 | 600.661 |
| 0.6236111111111111 | 604.864 |
| 0.6243055555555556 | 600.661 |
| 0.625 | 592.233 |
| 0.6256944444444444 | 583.779 |
| 0.6263888888888889 | 575.299 |
| 0.6270833333333333 | 566.793 |
| 0.6277777777777778 | 562.53 |
| 0.6284722222222222 | 558.261 |
| 0.6291666666666667 | 549.704 |
| 0.6298611111111111 | 545.416 |
| 0.6305555555555555 | 541.121 |
| 0.63125 | 549.704 |
| 0.6319444444444444 | 549.704 |
| 0.6326388888888889 | 242.127 |
| 0.6333333333333333 | 228.436 |
| 0.6340277777777777 | 228.436 |
| 0.6347222222222222 | 233 |
| 0.6354166666666666 | 237.564 |
| 0.6361111111111112 | 242.127 |
| 0.6368055555555555 | 246.689 |
| 0.6375000000000001 | 515.223 |
| 0.6381944444444444 | 506.542 |
| 0.638888888888889 | 502.192 |
| 0.6395833333333333 | 489.108 |
| 0.6402777777777778 | 475.972 |
| 0.6409722222222222 | 467.187 |
| 0.6416666666666667 | 458.38 |
| 0.642361111111111 | 449.551 |
| 0.6430555555555556 | 445.129 |
| 0.6437499999999999 | 449.551 |
| 0.6444444444444445 | 449.551 |
| 0.6451388888888888 | 445.129 |
| 0.6458333333333334 | 436.27 |
| 0.6465277777777778 | 418.492 |
| 0.6472222222222223 | 400.638 |
| 0.6479166666666667 | 387.202 |
| 0.6486111111111111 | 378.224 |
| 0.6493055555555556 | 382.715 |
| 0.65 | 378.224 |
| 0.6506944444444445 | 378.224 |
| 0.6513888888888889 | 373.729 |
| 0.6520833333333333 | 369.23 |
| 0.6527777777777778 | 360.221 |
| 0.6534722222222222 | 346.682 |
| 0.6541666666666667 | 342.162 |
| 0.6548611111111111 | 342.162 |
| 0.6555555555555556 | 342.162 |
| 0.65625 | 342.162 |
| 0.6569444444444444 | 346.682 |
| 0.6576388888888889 | 346.682 |
| 0.6583333333333333 | 351.198 |
| 0.6590277777777778 | 346.682 |
| 0.6597222222222222 | 346.682 |
| 0.6604166666666667 | 342.162 |
| 0.6611111111111111 | 333.113 |
| 0.6618055555555555 | 328.584 |
| 0.6625 | 324.052 |
| 0.6631944444444444 | 319.517 |
| 0.6638888888888889 | 314.98 |
| 0.6645833333333333 | 310.44 |
| 0.6652777777777777 | 310.44 |
| 0.6659722222222222 | 310.44 |
| 0.6666666666666666 | 310.44 |
| 0.6673611111111111 | 310.44 |
| 0.6680555555555556 | 305.898 |
| 0.6687500000000001 | 305.898 |
| 0.6694444444444444 | 301.354 |
| 0.6701388888888888 | 296.808 |
| 0.6708333333333334 | 296.808 |
| 0.6715277777777778 | 301.354 |
| 0.6722222222222222 | 292.259 |
| 0.6729166666666666 | 283.156 |
| 0.6736111111111112 | 264.932 |
| 0.6743055555555556 | 255.813 |
| 0.6749999999999999 | 255.813 |
| 0.6756944444444444 | 260.373 |
| 0.6763888888888889 | 269.49 |
| 0.6770833333333334 | 278.603 |
| 0.6777777777777777 | 278.603 |
| 0.6784722222222223 | 260.373 |
| 0.6791666666666667 | 278.603 |
| 0.6798611111111111 | 242.127 |
| 0.6805555555555555 | 233 |
| 0.68125 | 269.49 |
| 0.6819444444444445 | 242.127 |
| 0.6826388888888889 | 274.047 |
| 0.6833333333333332 | 274.047 |
| 0.6840277777777778 | 287.709 |
| 0.6847222222222222 | 287.709 |
| 0.6854166666666667 | 287.709 |
| 0.686111111111111 | 283.156 |
| 0.6868055555555556 | 269.49 |
| 0.6875 | 287.709 |
| 0.6881944444444444 | 287.709 |
| 0.688888888888889 | 278.603 |
| 0.6895833333333333 | 269.49 |
| 0.6902777777777778 | 269.49 |
| 0.6909722222222222 | 264.932 |
| 0.6916666666666668 | 255.813 |
| 0.6923611111111111 | 246.689 |
| 0.6930555555555555 | 242.127 |
| 0.69375 | 242.127 |
| 0.6944444444444445 | 242.127 |
| 0.6951388888888889 | 242.127 |
| 0.6958333333333333 | 242.127 |
| 0.6965277777777777 | 237.564 |
| 0.6972222222222223 | 237.564 |
| 0.6979166666666666 | 237.564 |
| 0.6986111111111111 | 233 |
| 0.6993055555555556 | 233 |
| 0.7000000000000001 | 228.436 |
| 0.7006944444444444 | 228.436 |
| 0.7013888888888888 | 228.436 |
| 0.7020833333333334 | 223.873 |
| 0.7027777777777778 | 223.873 |
| 0.7034722222222222 | 223.873 |
| 0.7041666666666666 | 228.436 |
| 0.7048611111111112 | 233 |
| 0.7055555555555556 | 237.564 |
| 0.7062499999999999 | 237.564 |
| 0.7069444444444444 | 223.873 |
| 0.7076388888888889 | 205.62 |
| 0.7083333333333334 | 191.937 |
| 0.7090277777777777 | 178.264 |
| 0.7097222222222223 | 169.156 |
| 0.7104166666666667 | 169.156 |
| 0.7111111111111111 | 173.709 |
| 0.7118055555555555 | 182.82 |
| 0.7125 | 182.82 |
| 0.7131944444444445 | 164.605 |
| 0.7138888888888889 | 164.605 |
| 0.7145833333333332 | 164.605 |
| 0.7152777777777778 | 160.056 |
| 0.7159722222222222 | 150.964 |
| 0.7166666666666667 | 150.964 |
| 0.717361111111111 | 141.884 |
| 0.7180555555555556 | 141.884 |
| 0.71875 | 137.347 |
| 0.7194444444444444 | 132.814 |
| 0.720138888888889 | 132.814 |
| 0.7208333333333333 | 146.423 |
| 0.7215277777777778 | 160.056 |
| 0.7222222222222222 | 155.509 |
| 0.7229166666666668 | 173.709 |
| 0.7236111111111111 | 178.264 |
| 0.7243055555555555 | 178.264 |
| 0.725 | 173.709 |
| 0.7256944444444445 | 173.709 |
| 0.7263888888888889 | 173.709 |
| 0.7270833333333333 | 173.709 |
| 0.7277777777777777 | 178.264 |
| 0.7284722222222223 | 173.709 |
| 0.7291666666666666 | 173.709 |
| 0.7298611111111111 | 173.709 |
| 0.7305555555555556 | 164.605 |
| 0.7312500000000001 | 169.156 |
| 0.7319444444444444 | 169.156 |
| 0.7326388888888888 | 169.156 |
| 0.7333333333333334 | 164.605 |
| 0.7340277777777778 | 164.605 |
| 0.7347222222222222 | 164.605 |
| 0.7354166666666666 | 160.056 |
| 0.7361111111111112 | 155.509 |
| 0.7368055555555556 | 150.964 |
| 0.7374999999999999 | 146.423 |
| 0.7381944444444444 | 141.884 |
| 0.7388888888888889 | 137.347 |
| 0.7395833333333334 | 132.814 |
| 0.7402777777777777 | 128.284 |
| 0.7409722222222223 | 132.814 |
| 0.7416666666666667 | 128.284 |
| 0.7423611111111111 | 128.284 |
| 0.7430555555555555 | 132.814 |
| 0.74375 | 132.814 |
| 0.7444444444444445 | 137.347 |
| 0.7451388888888889 | 141.884 |
| 0.7458333333333332 | 146.423 |
| 0.7465277777777778 | 155.509 |
| 0.7472222222222222 | 155.509 |
| 0.7479166666666667 | 155.509 |
| 0.748611111111111 | 155.509 |
| 0.7493055555555556 | 150.964 |
| 0.75 | 150.964 |
| 0.7506944444444444 | 150.964 |
| 0.751388888888889 | 160.056 |
| 0.7520833333333333 | 164.605 |
| 0.7527777777777778 | 164.605 |
| 0.7534722222222222 | 164.605 |
| 0.7541666666666668 | 164.605 |
| 0.7548611111111111 | 164.605 |
| 0.7555555555555555 | 160.056 |
| 0.75625 | 160.056 |
| 0.7569444444444445 | 160.056 |
| 0.7576388888888889 | 160.056 |
| 0.7583333333333333 | 160.056 |
| 0.7590277777777777 | 160.056 |
| 0.7597222222222223 | 155.509 |
| 0.7604166666666666 | 155.509 |
| 0.7611111111111111 | 155.509 |
| 0.7618055555555556 | 150.964 |
| 0.7625000000000001 | 141.884 |
| 0.7631944444444444 | 137.347 |
| 0.7638888888888888 | 137.347 |
| 0.7645833333333334 | 137.347 |
| 0.7652777777777778 | 137.347 |
| 0.7659722222222222 | 137.347 |
| 0.7666666666666666 | 137.347 |
| 0.7673611111111112 | 132.814 |
| 0.7680555555555556 | 141.884 |
| 0.7687499999999999 | 137.347 |
| 0.7694444444444444 | 137.347 |
| 0.7701388888888889 | 132.814 |
| 0.7708333333333334 | 132.814 |
| 0.7715277777777777 | 132.814 |
| 0.7722222222222223 | 137.347 |
| 0.7729166666666667 | 137.347 |
| 0.7736111111111111 | 137.347 |
| 0.7743055555555555 | 132.814 |
| 0.775 | 123.758 |
| 0.7756944444444445 | 123.758 |
| 0.7763888888888889 | 119.235 |
| 0.7770833333333332 | 119.235 |
| 0.7777777777777778 | 123.758 |
| 0.7784722222222222 | 132.814 |
| 0.7791666666666667 | 137.347 |
| 0.779861111111111 | 137.347 |
| 0.7805555555555556 | 132.814 |
| 0.78125 | 123.758 |
| 0.7819444444444444 | 119.235 |
| 0.782638888888889 | 114.716 |
| 0.7833333333333333 | 110.201 |
| 0.7840277777777778 | 105.69 |
| 0.7847222222222222 | 101.184 |
| 0.7854166666666668 | 96.682 |
| 0.7861111111111111 | 92.184 |
| 0.7868055555555555 | 87.692 |
| 0.7875 | 83.205 |
| 0.7881944444444445 | 78.722 |
| 0.7888888888888889 | 78.722 |
| 0.7895833333333333 | 74.246 |
| 0.7902777777777777 | 69.775 |
| 0.7909722222222223 | 69.775 |
| 0.7916666666666666 | 65.31 |
| 0.7923611111111111 | 65.31 |
| 0.7930555555555556 | 65.31 |
| 0.7937500000000001 | 65.31 |
| 0.7944444444444444 | 65.31 |
| 0.7951388888888888 | 65.31 |
| 0.7958333333333334 | 65.31 |
| 0.7965277777777778 | 69.775 |
| 0.7972222222222222 | 69.775 |
| 0.7979166666666666 | 74.246 |
| 0.7986111111111112 | 74.246 |
| 0.7993055555555556 | 78.722 |
| 0.7999999999999999 | 78.722 |
| 0.8006944444444444 | 83.205 |
| 0.8013888888888889 | 83.205 |
| 0.8020833333333334 | 83.205 |
| 0.8027777777777777 | 83.205 |
| 0.8034722222222223 | 74.246 |
| 0.8041666666666667 | 69.775 |
| 0.8048611111111111 | 60.85 |
| 0.8055555555555555 | 56.398 |
| 0.80625 | 56.398 |
| 0.8069444444444445 | 56.398 |
| 0.8076388888888889 | 56.398 |
| 0.8083333333333332 | 60.85 |
| 0.8090277777777778 | 65.31 |
| 0.8097222222222222 | 69.775 |
| 0.8104166666666667 | 83.205 |
| 0.811111111111111 | 87.692 |
| 0.8118055555555556 | 87.692 |
| 0.8125 | 83.205 |
| 0.8131944444444444 | 83.205 |
| 0.813888888888889 | 83.205 |
| 0.8145833333333333 | 78.722 |
| 0.8152777777777778 | 74.246 |
| 0.8159722222222222 | 69.775 |
| 0.8166666666666668 | 65.31 |
| 0.8173611111111111 | 65.31 |
| 0.8180555555555555 | 60.85 |
| 0.81875 | 56.398 |
| 0.8194444444444445 | 56.398 |
| 0.8201388888888889 | 56.398 |
| 0.8208333333333333 | 51.951 |
| 0.8215277777777777 | 47.511 |
| 0.8222222222222223 | 43.079 |
| 0.8229166666666666 | 43.079 |
| 0.8236111111111111 | 38.653 |
| 0.8243055555555556 | 38.653 |
| 0.8250000000000001 | 34.234 |
| 0.8256944444444444 | 34.234 |
| 0.8263888888888888 | 29.823 |
| 0.8270833333333334 | 29.823 |
| 0.8277777777777778 | 29.823 |
| 0.8284722222222222 | 25.419 |
| 0.8291666666666666 | 21.024 |
| 0.8298611111111112 | 21.024 |
| 0.8305555555555556 | 21.024 |
| 0.8312499999999999 | 16.636 |
| 0.8319444444444444 | 16.636 |
| 0.8326388888888889 | 16.636 |
| 0.8333333333333334 | 12.257 |
| 0.8340277777777777 | 12.257 |
| 0.8347222222222223 | 12.257 |
| 0.8354166666666667 | 12.257 |
| 0.8361111111111111 | 12.257 |
| 0.8368055555555555 | 7.887 |
| 0.8375 | 7.887 |
| 0.8381944444444445 | 7.887 |
| 0.8388888888888889 | 7.887 |
| 0.8395833333333332 | 7.887 |
| 0.8402777777777778 | 3.525 |
| 0.8409722222222222 | 3.525 |
| 0.8416666666666667 | 3.525 |
| 0.842361111111111 | 3.525 |
| 0.8430555555555556 | 3.525 |
| 0.84375 | 0 |
| 0.8444444444444444 | 0 |
| 0.845138888888889 | 0 |
| 0.8458333333333333 | 0 |
| 0.8465277777777778 | 0 |
| 0.8472222222222222 | 0 |
| 0.8479166666666668 | 0 |
| 0.8486111111111111 | 0 |
| 0.8493055555555555 | 0 |
| 0.85 | 0 |
| 0.8506944444444445 | 0 |
| 0.8513888888888889 | 0 |
| 0.8520833333333333 | 0 |
| 0.8527777777777777 | 0 |
| 0.8534722222222223 | 0 |
| 0.8541666666666666 | 0 |
| 0.8548611111111111 | 0 |
| 0.8555555555555556 | 0 |
| 0.8562500000000001 | 0 |
| 0.8569444444444444 | 0 |
| 0.8576388888888888 | 0 |
| 0.8583333333333334 | 0 |
| 0.8590277777777778 | 0 |
| 0.8597222222222222 | 0 |
| 0.8604166666666666 | 0 |
| 0.8611111111111112 | 0 |
| 0.8618055555555556 | 0 |
| 0.8624999999999999 | 0 |
| 0.8631944444444444 | 0 |
| 0.8638888888888889 | 0 |
| 0.8645833333333334 | 0 |
| 0.8652777777777777 | 0 |
| 0.8659722222222223 | 0 |
| 0.8666666666666667 | 0 |
| 0.8673611111111111 | 0 |
| 0.8680555555555555 | 0 |
| 0.86875 | 0 |
| 0.8694444444444445 | 0 |
| 0.8701388888888889 | 0 |
| 0.8708333333333332 | 0 |
| 0.8715277777777778 | 0 |
| 0.8722222222222222 | 0 |
| 0.8729166666666667 | 0 |
| 0.873611111111111 | 0 |
| 0.8743055555555556 | 0 |
| 0.875 | 0 |
| 0.8756944444444444 | 0 |
| 0.876388888888889 | 0 |
| 0.8770833333333333 | 0 |
| 0.8777777777777778 | 0 |
| 0.8784722222222222 | 0 |
| 0.8791666666666668 | 0 |
| 0.8798611111111111 | 0 |
| 0.8805555555555555 | 0 |
| 0.88125 | 0 |
| 0.8819444444444445 | 0 |
| 0.8826388888888889 | 0 |
| 0.8833333333333333 | 0 |
| 0.8840277777777777 | 0 |
| 0.8847222222222223 | 0 |
| 0.8854166666666666 | 0 |
| 0.8861111111111111 | 0 |
| 0.8868055555555556 | 0 |
| 0.8875000000000001 | 0 |
| 0.8881944444444444 | 0 |
| 0.8888888888888888 | 0 |
| 0.8895833333333334 | 0 |
| 0.8902777777777778 | 0 |
| 0.8909722222222222 | 0 |
| 0.8916666666666666 | 0 |
| 0.8923611111111112 | 0 |
| 0.8930555555555556 | 0 |
| 0.8937499999999999 | 0 |
| 0.8944444444444444 | 0 |
| 0.8951388888888889 | 0 |
| 0.8958333333333334 | 0 |
| 0.8965277777777777 | 0 |
| 0.8972222222222223 | 0 |
| 0.8979166666666667 | 0 |
| 0.8986111111111111 | 0 |
| 0.8993055555555555 | 0 |
| 0.9 | 0 |
| 0.9006944444444445 | 0 |
| 0.9013888888888889 | 0 |
| 0.9020833333333332 | 0 |
| 0.9027777777777778 | 0 |
| 0.9034722222222222 | 0 |
| 0.9041666666666667 | 0 |
| 0.904861111111111 | 0 |
| 0.9055555555555556 | 0 |
| 0.90625 | 0 |
| 0.9069444444444444 | 0 |
| 0.907638888888889 | 0 |
| 0.9083333333333333 | 0 |
| 0.9090277777777778 | 0 |
| 0.9097222222222222 | 0 |
| 0.9104166666666668 | 0 |
| 0.9111111111111111 | 0 |
| 0.9118055555555555 | 0 |
| 0.9125 | 0 |
| 0.9131944444444445 | 0 |
| 0.9138888888888889 | 0 |
| 0.9145833333333333 | 0 |
| 0.9152777777777777 | 0 |
| 0.9159722222222223 | 0 |
| 0.9166666666666666 | 0 |
| 0.9173611111111111 | 0 |
| 0.9180555555555556 | 0 |
| 0.9187500000000001 | 0 |
| 0.9194444444444444 | 0 |
| 0.9201388888888888 | 0 |
| 0.9208333333333334 | 0 |
| 0.9215277777777778 | 0 |
| 0.9222222222222222 | 0 |
| 0.9229166666666666 | 0 |
| 0.9236111111111112 | 0 |
| 0.9243055555555556 | 0 |
| 0.9249999999999999 | 0 |
| 0.9256944444444444 | 0 |
| 0.9263888888888889 | 0 |
| 0.9270833333333334 | 0 |
| 0.9277777777777777 | 0 |
| 0.9284722222222223 | 0 |
| 0.9291666666666667 | 0 |
| 0.9298611111111111 | 0 |
| 0.9305555555555555 | 0 |
| 0.93125 | 0 |
| 0.9319444444444445 | 0 |
| 0.9326388888888889 | 0 |
| 0.9333333333333332 | 0 |
| 0.9340277777777778 | 0 |
| 0.9347222222222222 | 0 |
| 0.9354166666666667 | 0 |
| 0.936111111111111 | 0 |
| 0.9368055555555556 | 0 |
| 0.9375 | 0 |
| 0.9381944444444444 | 0 |
| 0.938888888888889 | 0 |
| 0.9395833333333333 | 0 |
| 0.9402777777777778 | 0 |
| 0.9409722222222222 | 0 |
| 0.9416666666666668 | 0 |
| 0.9423611111111111 | 0 |
| 0.9430555555555555 | 0 |
| 0.94375 | 0 |
| 0.9444444444444445 | 0 |
| 0.9451388888888889 | 0 |
| 0.9458333333333333 | 0 |
| 0.9465277777777777 | 0 |
| 0.9472222222222223 | 0 |
| 0.9479166666666666 | 0 |
| 0.9486111111111111 | 0 |
| 0.9493055555555556 | 0 |
| 0.9500000000000001 | 0 |
| 0.9506944444444444 | 0 |
| 0.9513888888888888 | 0 |
| 0.9520833333333334 | 0 |
| 0.9527777777777778 | 0 |
| 0.9534722222222222 | 0 |
| 0.9541666666666666 | 0 |
| 0.9548611111111112 | 0 |
| 0.9555555555555556 | 0 |
| 0.9562499999999999 | 0 |
| 0.9569444444444444 | 0 |
| 0.9576388888888889 | 0 |
| 0.9583333333333334 | 0 |
| 0.9590277777777777 | 0 |
| 0.9597222222222223 | 0 |
| 0.9604166666666667 | 0 |
| 0.9611111111111111 | 0 |
| 0.9618055555555555 | 0 |
| 0.9625 | 0 |
| 0.9631944444444445 | 0 |
| 0.9638888888888889 | 0 |
| 0.9645833333333332 | 0 |
| 0.9652777777777778 | 0 |
| 0.9659722222222222 | 0 |
| 0.9666666666666667 | 0 |
| 0.967361111111111 | 0 |
| 0.9680555555555556 | 0 |
| 0.96875 | 0 |
| 0.9694444444444444 | 0 |
| 0.970138888888889 | 0 |
| 0.9708333333333333 | 0 |
| 0.9715277777777778 | 0 |
| 0.9722222222222222 | 0 |
| 0.9729166666666668 | 0 |
| 0.9736111111111111 | 0 |
| 0.9743055555555555 | 0 |
| 0.975 | 0 |
| 0.9756944444444445 | 0 |
| 0.9763888888888889 | 0 |
| 0.9770833333333333 | 0 |
| 0.9777777777777777 | 0 |
| 0.9784722222222223 | 0 |
| 0.9791666666666666 | 0 |
| 0.9798611111111111 | 0 |
| 0.9805555555555556 | 0 |
| 0.9812500000000001 | 0 |
| 0.9819444444444444 | 0 |
| 0.9826388888888888 | 0 |
| 0.9833333333333334 | 0 |
| 0.9840277777777778 | 0 |
| 0.9847222222222222 | 0 |
| 0.9854166666666666 | 0 |
| 0.9861111111111112 | 0 |
| 0.9868055555555556 | 0 |
| 0.9874999999999999 | 0 |
| 0.9881944444444444 | 0 |
| 0.9888888888888889 | 0 |
| 0.9895833333333334 | 0 |
| 0.9902777777777777 | 0 |
| 0.9909722222222223 | 0 |
| 0.9916666666666667 | 0 |
| 0.9923611111111111 | 0 |
| 0.9930555555555555 | 0 |
| 0.99375 | 0 |
| 0.9944444444444445 | 0 |
| 0.9951388888888889 | 0 |
| 0.9958333333333332 | 0 |
| 0.9965277777777778 | 0 |
| 0.9972222222222222 | 0 |
| 0.9979166666666667 | 0 |
| 0.998611111111111 | 0 |
| 0.9993055555555556 | 0 |